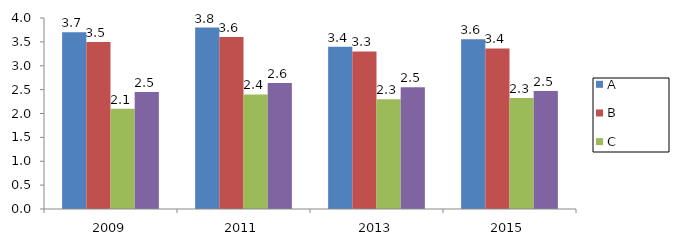
| Category | A | B | C | Ensemble |
|---|---|---|---|---|
| 2009.0 | 3.7 | 3.5 | 2.1 | 2.45 |
| 2011.0 | 3.8 | 3.6 | 2.4 | 2.64 |
| 2013.0 | 3.4 | 3.3 | 2.3 | 2.55 |
| 2015.0 | 3.555 | 3.363 | 2.324 | 2.47 |